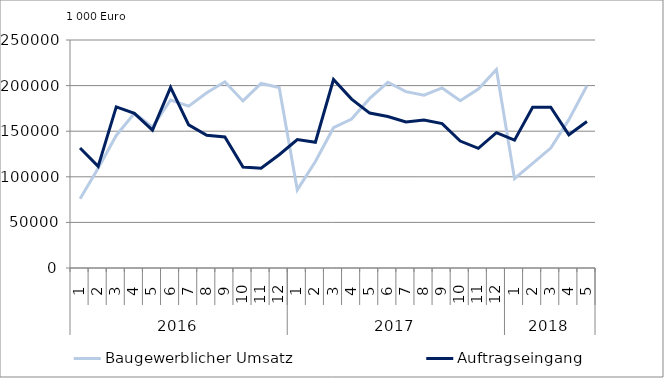
| Category | Baugewerblicher Umsatz | Auftragseingang |
|---|---|---|
| 0 | 76043.538 | 131571.482 |
| 1 | 109483.268 | 111467.248 |
| 2 | 145343.559 | 176673.268 |
| 3 | 169660.551 | 169566.96 |
| 4 | 154554.865 | 151228.165 |
| 5 | 184236.137 | 198035.655 |
| 6 | 177444.278 | 156900.898 |
| 7 | 192230.472 | 145537.167 |
| 8 | 204178.065 | 143616.217 |
| 9 | 183173.849 | 110770.94 |
| 10 | 202302.279 | 109384.188 |
| 11 | 197832.096 | 124193.91 |
| 12 | 85701.947 | 140751.008 |
| 13 | 116743.276 | 137863.383 |
| 14 | 153810.055 | 206710.579 |
| 15 | 163342.989 | 185183.797 |
| 16 | 185946.221 | 169878.51 |
| 17 | 203627.91 | 166148.392 |
| 18 | 193377.256 | 160134.206 |
| 19 | 189429.952 | 162221.206 |
| 20 | 197405.279 | 158305.285 |
| 21 | 183450.026 | 139156.761 |
| 22 | 196209.214 | 131165.419 |
| 23 | 217688.447 | 148434.901 |
| 24 | 97959.056 | 140119.385 |
| 25 | 114756.787 | 176330.213 |
| 26 | 131454.642 | 176241.061 |
| 27 | 162648.053 | 146063.407 |
| 28 | 199809.407 | 160551.931 |